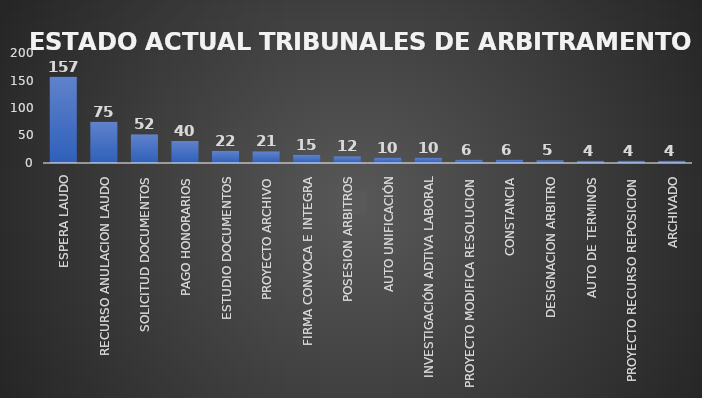
| Category | CANTIDAD | % |
|---|---|---|
| ESPERA LAUDO | 157 | 0.334 |
| RECURSO ANULACION LAUDO | 75 | 0.159 |
| SOLICITUD DOCUMENTOS | 52 | 0.12 |
| PAGO HONORARIOS | 40 | 0.077 |
| ESTUDIO DOCUMENTOS | 22 | 0.049 |
| PROYECTO ARCHIVO | 21 | 0.052 |
| FIRMA CONVOCA E INTEGRA | 15 | 0.032 |
| POSESION ARBITROS | 12 | 0.025 |
| AUTO UNIFICACIÓN | 10 | 0.021 |
| INVESTIGACIÓN ADTIVA LABORAL | 10 | 0.02 |
| PROYECTO MODIFICA RESOLUCION | 6 | 0.011 |
| CONSTANCIA | 6 | 0.014 |
| DESIGNACION ARBITRO | 5 | 0.013 |
| AUTO DE TERMINOS | 4 | 0.012 |
| PROYECTO RECURSO REPOSICION | 4 | 0.009 |
| ARCHIVADO | 4 | 0.009 |